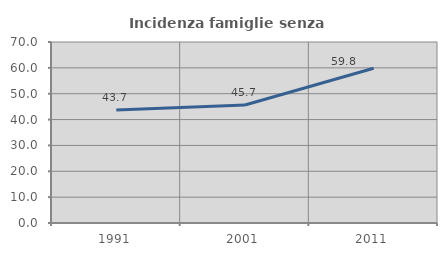
| Category | Incidenza famiglie senza nuclei |
|---|---|
| 1991.0 | 43.662 |
| 2001.0 | 45.652 |
| 2011.0 | 59.843 |